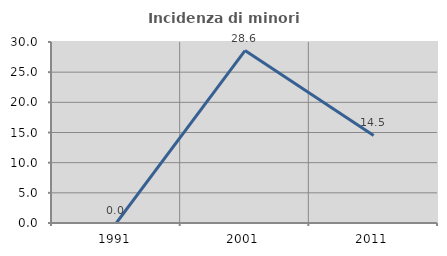
| Category | Incidenza di minori stranieri |
|---|---|
| 1991.0 | 0 |
| 2001.0 | 28.571 |
| 2011.0 | 14.516 |